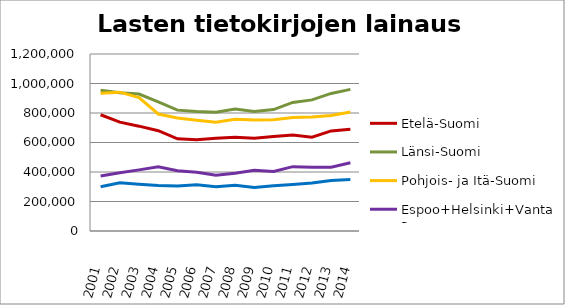
| Category | Etelä-Suomi | Länsi-Suomi | Pohjois- ja Itä-Suomi | Espoo+Helsinki+Vantaa | Muu Uusimaa |
|---|---|---|---|---|---|
| 2001.0 | 788070 | 953790 | 933989 | 372429 | 299994 |
| 2002.0 | 737802 | 937650 | 941155 | 395319 | 327528 |
| 2003.0 | 710780 | 928767 | 904370 | 414496 | 317340 |
| 2004.0 | 679954 | 875954 | 793165 | 435723 | 308110 |
| 2005.0 | 624604 | 819468 | 765480 | 408207 | 304987 |
| 2006.0 | 619398 | 809542 | 750317 | 398910 | 313375 |
| 2007.0 | 628798 | 805505 | 736660 | 378366 | 299261 |
| 2008.0 | 635724 | 826759 | 758106 | 391895 | 310886 |
| 2009.0 | 629359 | 810325 | 752130 | 411015 | 295298 |
| 2010.0 | 640131 | 823445 | 754603 | 402956 | 307246 |
| 2011.0 | 650331 | 871796 | 768864 | 436130 | 315217 |
| 2012.0 | 635355 | 888804 | 773057 | 432199 | 325687 |
| 2013.0 | 678723 | 932674 | 783627 | 432953 | 342650 |
| 2014.0 | 689180 | 960053 | 807106 | 463184 | 348971 |